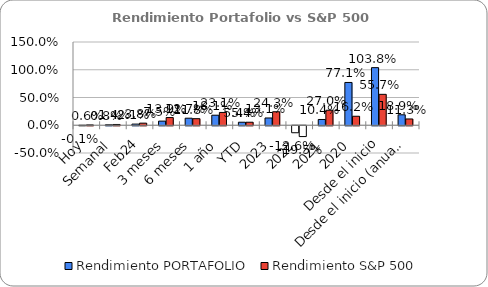
| Category | Rendimiento PORTAFOLIO | Rendimiento S&P 500 |
|---|---|---|
| Hoy | -0.001 | 0.006 |
| Semanal | 0.008 | 0.014 |
| Feb24 | 0.021 | 0.038 |
| 3 meses | 0.075 | 0.139 |
| 6 meses | 0.127 | 0.118 |
| 1 año | 0.181 | 0.231 |
| YTD | 0.054 | 0.054 |
| 2023 | 0.131 | 0.243 |
| 2022 | -0.126 | -0.195 |
| 2021 | 0.104 | 0.27 |
| 2020 | 0.771 | 0.162 |
| Desde el inicio | 1.038 | 0.557 |
| Desde el inicio (anual) | 0.189 | 0.113 |